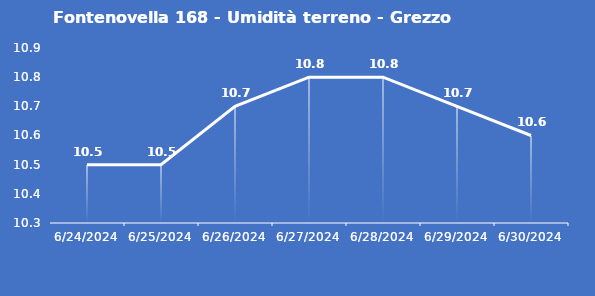
| Category | Fontenovella 168 - Umidità terreno - Grezzo (%VWC) |
|---|---|
| 6/24/24 | 10.5 |
| 6/25/24 | 10.5 |
| 6/26/24 | 10.7 |
| 6/27/24 | 10.8 |
| 6/28/24 | 10.8 |
| 6/29/24 | 10.7 |
| 6/30/24 | 10.6 |